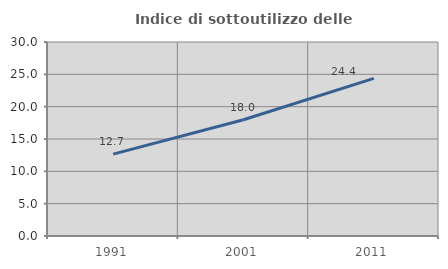
| Category | Indice di sottoutilizzo delle abitazioni  |
|---|---|
| 1991.0 | 12.656 |
| 2001.0 | 17.97 |
| 2011.0 | 24.372 |